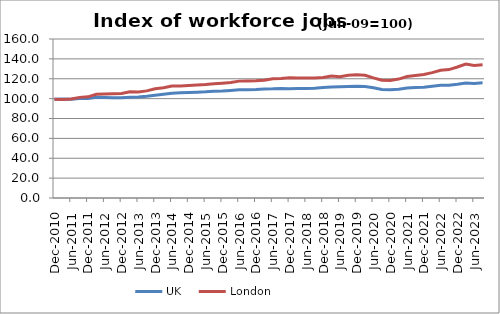
| Category | UK | London |
|---|---|---|
| 2010-12-01 | 99.456 | 99.368 |
| 2011-03-01 | 99.704 | 99.238 |
| 2011-06-01 | 99.453 | 99.529 |
| 2011-09-01 | 100.147 | 101.258 |
| 2011-12-01 | 100.2 | 101.778 |
| 2012-03-01 | 101.331 | 104.442 |
| 2012-06-01 | 101.133 | 104.594 |
| 2012-09-01 | 100.932 | 104.899 |
| 2012-12-01 | 100.793 | 105.128 |
| 2013-03-01 | 101.404 | 106.818 |
| 2013-06-01 | 101.584 | 106.561 |
| 2013-09-01 | 102.293 | 107.775 |
| 2013-12-01 | 103.463 | 109.88 |
| 2014-03-01 | 104.425 | 110.914 |
| 2014-06-01 | 105.391 | 112.697 |
| 2014-09-01 | 105.8 | 112.807 |
| 2014-12-01 | 106.153 | 113.183 |
| 2015-03-01 | 106.528 | 113.646 |
| 2015-06-01 | 106.803 | 114.212 |
| 2015-09-01 | 107.409 | 114.999 |
| 2015-12-01 | 107.64 | 115.59 |
| 2016-03-01 | 108.287 | 116.214 |
| 2016-06-01 | 108.913 | 117.612 |
| 2016-09-01 | 109.026 | 117.839 |
| 2016-12-01 | 109.262 | 118.08 |
| 2017-03-01 | 109.775 | 118.517 |
| 2017-06-01 | 109.845 | 119.942 |
| 2017-09-01 | 110.179 | 120.274 |
| 2017-12-01 | 109.919 | 120.909 |
| 2018-03-01 | 110.086 | 120.852 |
| 2018-06-01 | 110.218 | 120.791 |
| 2018-09-01 | 110.538 | 120.818 |
| 2018-12-01 | 111.088 | 121.346 |
| 2019-03-01 | 111.66 | 122.768 |
| 2019-06-01 | 112.034 | 122.077 |
| 2019-09-01 | 112.248 | 123.503 |
| 2019-12-01 | 112.413 | 124.062 |
| 2020-03-01 | 112.228 | 123.474 |
| 2020-06-01 | 110.847 | 120.842 |
| 2020-09-01 | 109.143 | 118.44 |
| 2020-12-01 | 108.809 | 118.196 |
| 2021-03-01 | 109.43 | 119.665 |
| 2021-06-01 | 110.583 | 122.17 |
| 2021-09-01 | 111.261 | 123.204 |
| 2021-12-01 | 111.407 | 124.309 |
| 2022-03-01 | 112.562 | 126.192 |
| 2022-06-01 | 113.348 | 128.495 |
| 2022-09-01 | 113.542 | 129.234 |
| 2022-12-01 | 114.501 | 131.801 |
| 2023-03-01 | 115.78 | 134.771 |
| 2023-06-01 | 115.336 | 133.425 |
| 2023-09-01 | 115.997 | 134.203 |